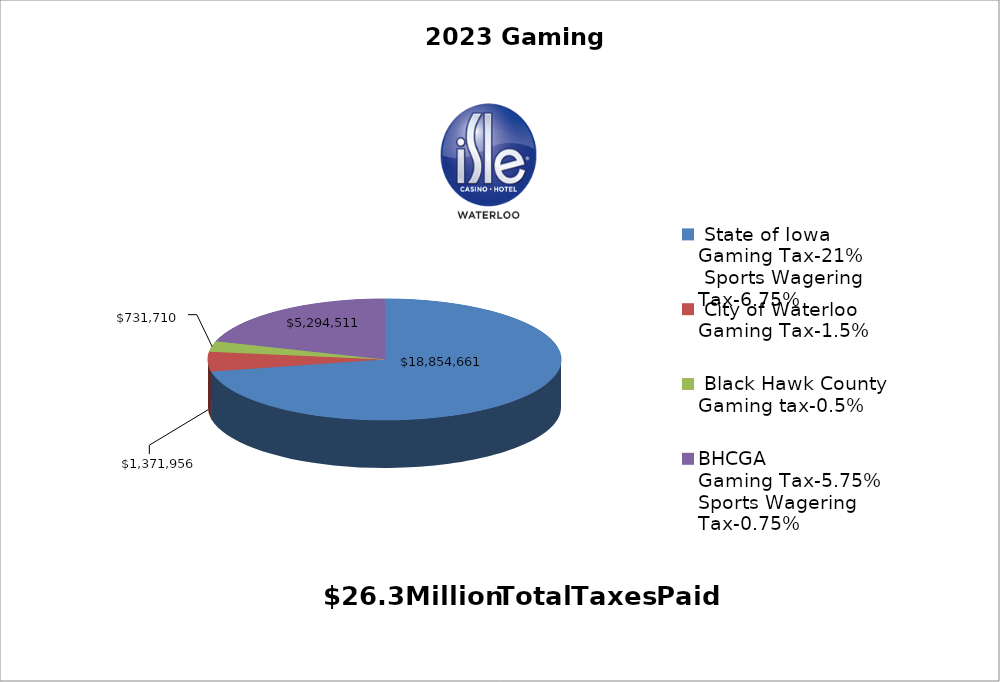
| Category | Series 0 |
|---|---|
|  State of Iowa                     Gaming Tax-21%                 Sports Wagering Tax-6.75%  | 18854660.75 |
|  City of Waterloo              Gaming Tax-1.5%  | 1371955.56 |
|  Black Hawk County            Gaming tax-0.5%  | 731709.61 |
| BHCGA                            Gaming Tax-5.75%          Sports Wagering Tax-0.75% | 5294510.53 |